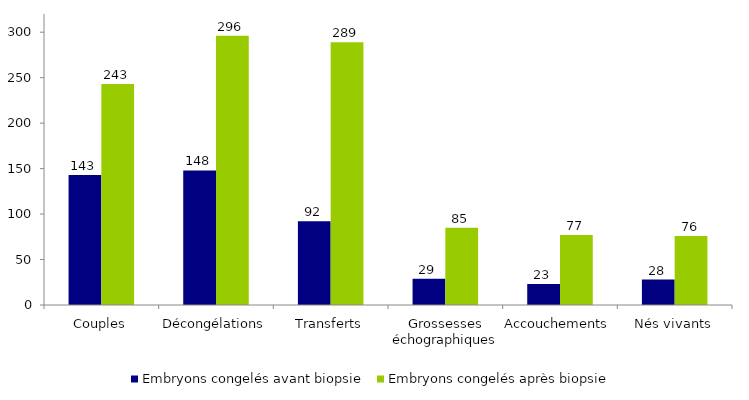
| Category | Embryons congelés avant biopsie | Embryons congelés après biopsie |
|---|---|---|
| Couples | 143 | 243 |
| Décongélations | 148 | 296 |
| Transferts | 92 | 289 |
| Grossesses échographiques | 29 | 85 |
| Accouchements | 23 | 77 |
| Nés vivants | 28 | 76 |